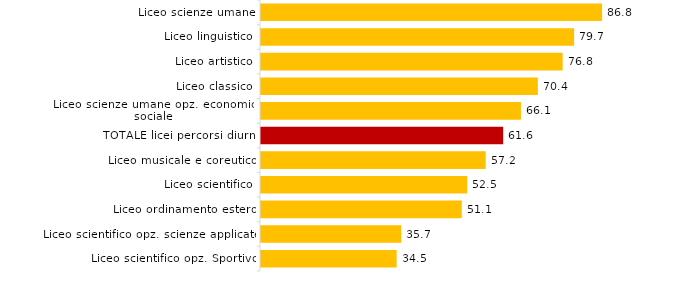
| Category | Quota Fem. |
|---|---|
| Liceo scientifico opz. Sportivo | 34.515 |
| Liceo scientifico opz. scienze applicate | 35.697 |
| Liceo ordinamento estero | 51.097 |
| Liceo scientifico | 52.485 |
| Liceo musicale e coreutico | 57.174 |
| TOTALE licei percorsi diurni | 61.62 |
| Liceo scienze umane opz. economico sociale | 66.148 |
| Liceo classico | 70.449 |
| Liceo artistico | 76.756 |
| Liceo linguistico | 79.67 |
| Liceo scienze umane | 86.789 |